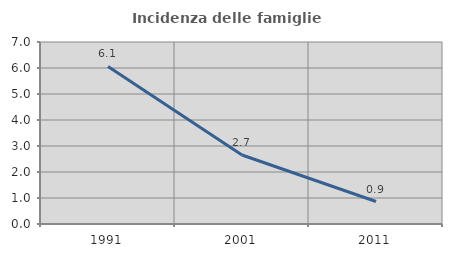
| Category | Incidenza delle famiglie numerose |
|---|---|
| 1991.0 | 6.061 |
| 2001.0 | 2.655 |
| 2011.0 | 0.865 |